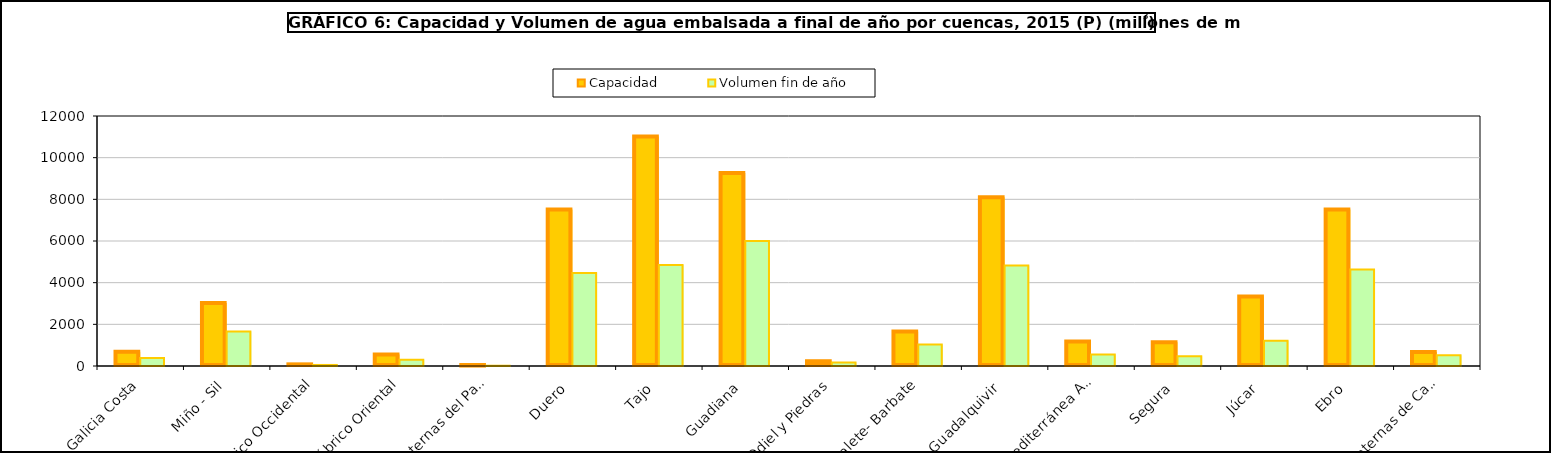
| Category | Capacidad | Volumen fin de año |
|---|---|---|
| Galicia Costa | 684 | 390 |
| Miño - Sil | 3030 | 1659 |
| Cantábrico Occidental | 79 | 50 |
| Cantábrico Oriental | 554 | 305 |
| Cuencas Internas del País Vasco | 21 | 13 |
| Duero  | 7507 | 4464 |
| Tajo  | 11012 | 4843 |
| Guadiana  | 9266 | 5997 |
| Tinto, Odiel y Piedras | 229 | 168 |
| Guadalete- Barbate | 1651 | 1032 |
| Guadalquivir  | 8101 | 4820 |
| Cuenca Mediterránea Andaluza | 1177 | 551 |
| Segura  | 1141 | 466 |
| Júcar  | 3337 | 1215 |
| Ebro  | 7511 | 4629 |
| Cuencas internas de Cataluña | 677 | 519 |